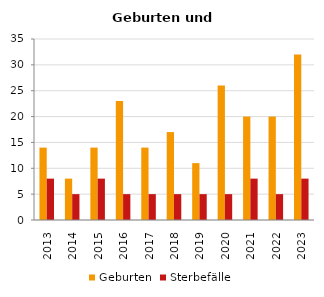
| Category | Geburten | Sterbefälle |
|---|---|---|
| 2013.0 | 14 | 8 |
| 2014.0 | 8 | 5 |
| 2015.0 | 14 | 8 |
| 2016.0 | 23 | 5 |
| 2017.0 | 14 | 5 |
| 2018.0 | 17 | 5 |
| 2019.0 | 11 | 5 |
| 2020.0 | 26 | 5 |
| 2021.0 | 20 | 8 |
| 2022.0 | 20 | 5 |
| 2023.0 | 32 | 8 |